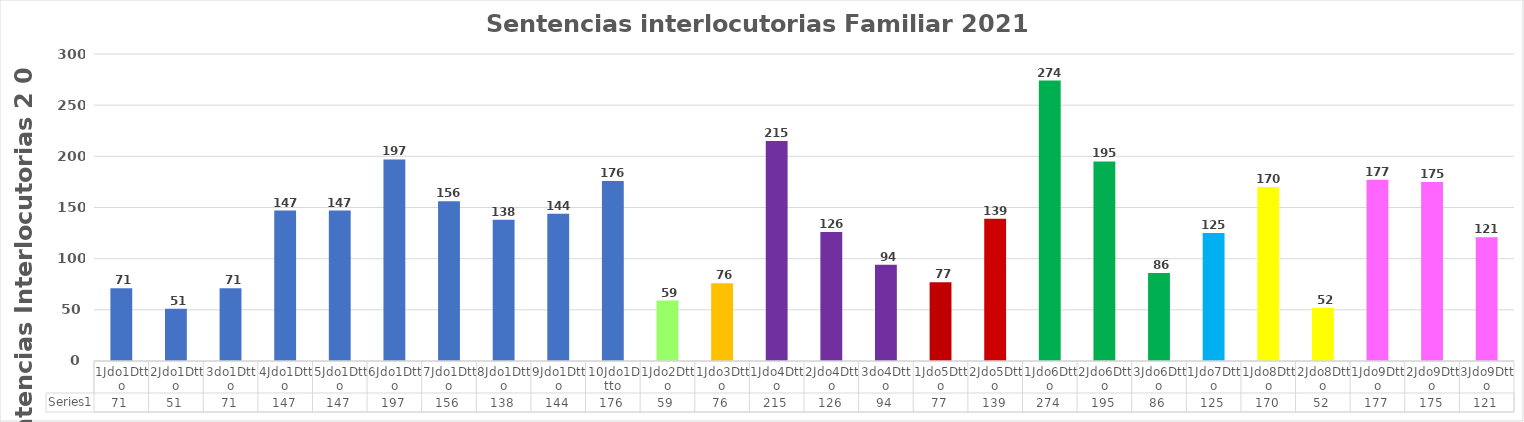
| Category | Series 0 |
|---|---|
| 1Jdo1Dtto | 71 |
| 2Jdo1Dtto | 51 |
| 3do1Dtto | 71 |
| 4Jdo1Dtto | 147 |
| 5Jdo1Dtto | 147 |
| 6Jdo1Dtto | 197 |
| 7Jdo1Dtto | 156 |
| 8Jdo1Dtto | 138 |
| 9Jdo1Dtto | 144 |
| 10Jdo1Dtto | 176 |
| 1Jdo2Dtto | 59 |
| 1Jdo3Dtto | 76 |
| 1Jdo4Dtto | 215 |
| 2Jdo4Dtto | 126 |
| 3do4Dtto | 94 |
| 1Jdo5Dtto | 77 |
| 2Jdo5Dtto | 139 |
| 1Jdo6Dtto | 274 |
| 2Jdo6Dtto | 195 |
| 3Jdo6Dtto | 86 |
| 1Jdo7Dtto | 125 |
| 1Jdo8Dtto | 170 |
| 2Jdo8Dtto | 52 |
| 1Jdo9Dtto | 177 |
| 2Jdo9Dtto | 175 |
| 3Jdo9Dtto | 121 |